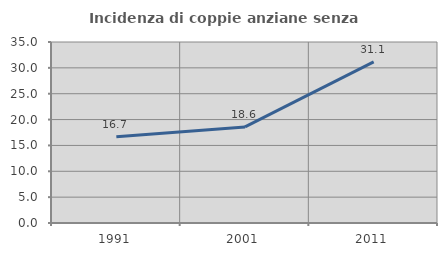
| Category | Incidenza di coppie anziane senza figli  |
|---|---|
| 1991.0 | 16.667 |
| 2001.0 | 18.571 |
| 2011.0 | 31.148 |